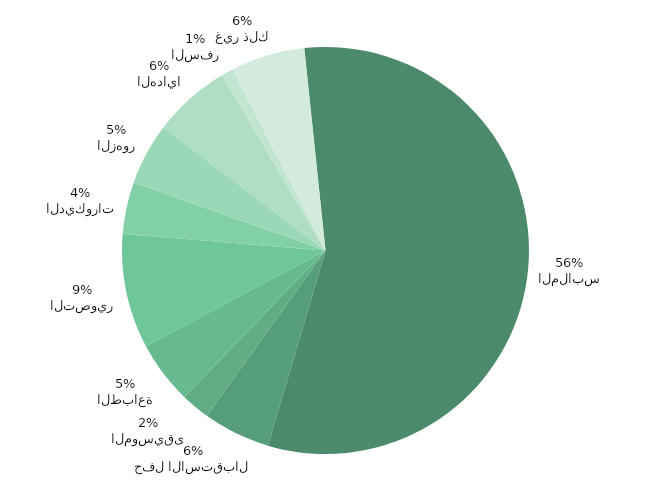
| Category | الفعلي |
|---|---|
| الملابس | 9770 |
| حفل الاستقبال | 928 |
| الموسيقى | 400 |
| الطباعة | 870 |
| التصوير | 1575 |
| الديكورات | 720 |
| الزهور | 850 |
| الهدايا | 1075 |
| السفر | 165 |
| غير ذلك | 1021 |